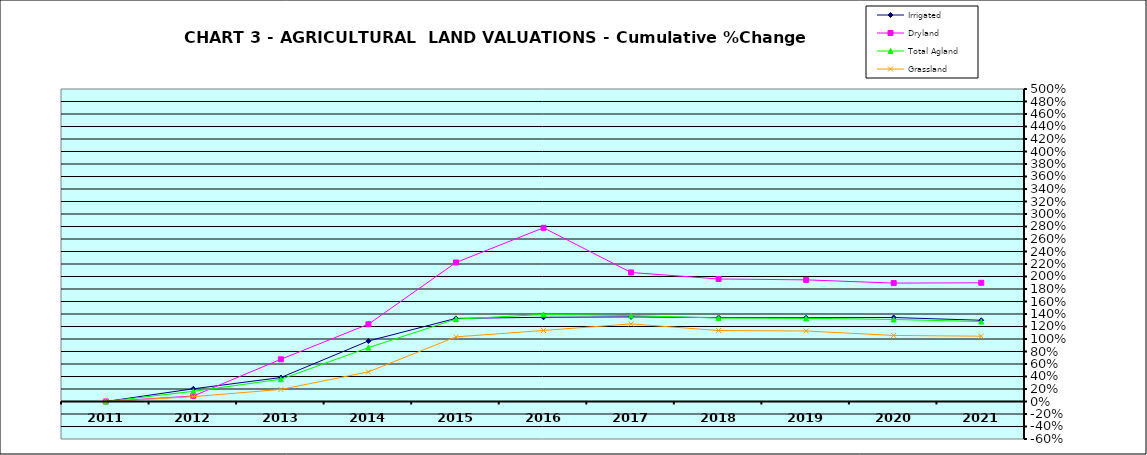
| Category | Irrigated | Dryland | Total Agland | Grassland |
|---|---|---|---|---|
| 2011.0 | 0 | 0 | 0 | 0 |
| 2012.0 | 0.203 | 0.088 | 0.163 | 0.078 |
| 2013.0 | 0.384 | 0.675 | 0.356 | 0.193 |
| 2014.0 | 0.968 | 1.237 | 0.862 | 0.474 |
| 2015.0 | 1.33 | 2.224 | 1.318 | 1.034 |
| 2016.0 | 1.348 | 2.779 | 1.393 | 1.136 |
| 2017.0 | 1.354 | 2.065 | 1.375 | 1.242 |
| 2018.0 | 1.343 | 1.96 | 1.335 | 1.135 |
| 2019.0 | 1.341 | 1.946 | 1.33 | 1.128 |
| 2020.0 | 1.344 | 1.894 | 1.312 | 1.057 |
| 2021.0 | 1.3 | 1.899 | 1.279 | 1.045 |